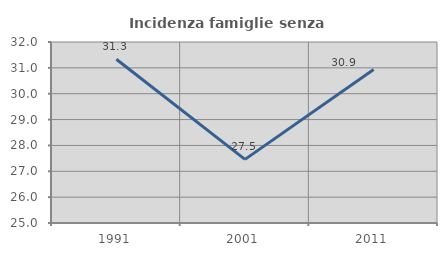
| Category | Incidenza famiglie senza nuclei |
|---|---|
| 1991.0 | 31.334 |
| 2001.0 | 27.461 |
| 2011.0 | 30.934 |